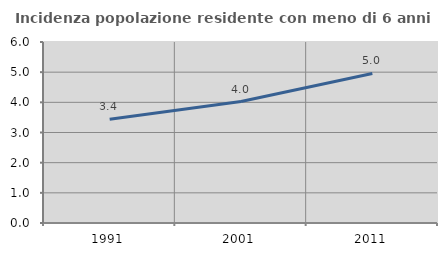
| Category | Incidenza popolazione residente con meno di 6 anni |
|---|---|
| 1991.0 | 3.442 |
| 2001.0 | 4.026 |
| 2011.0 | 4.957 |